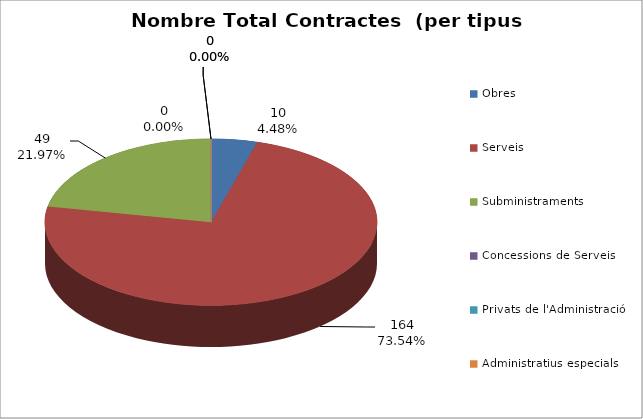
| Category | Nombre Total Contractes |
|---|---|
| Obres | 10 |
| Serveis | 164 |
| Subministraments | 49 |
| Concessions de Serveis | 0 |
| Privats de l'Administració | 0 |
| Administratius especials | 0 |